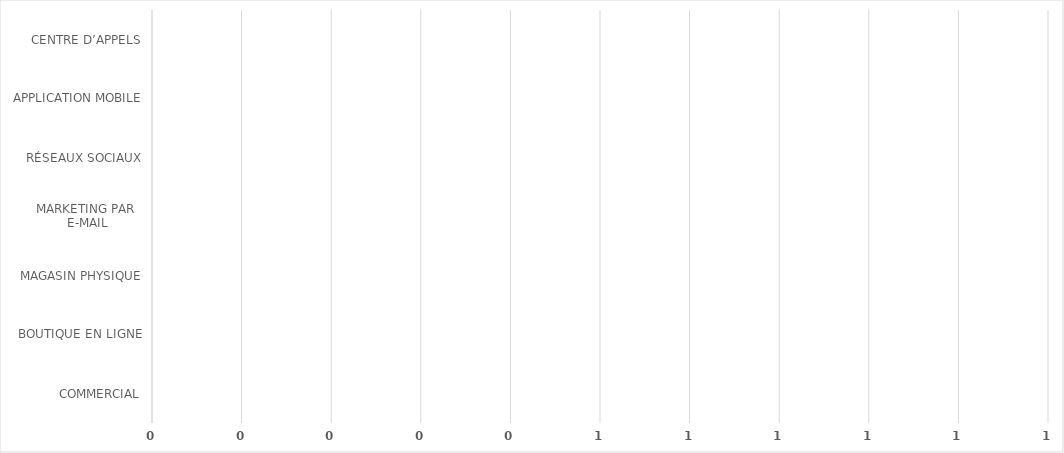
| Category | Series 0 |
|---|---|
| COMMERCIAL | 0 |
| BOUTIQUE EN LIGNE | 0 |
| MAGASIN PHYSIQUE | 0 |
| MARKETING PAR 
E-MAIL | 0 |
| RÉSEAUX SOCIAUX | 0 |
| APPLICATION MOBILE | 0 |
| CENTRE D’APPELS | 0 |